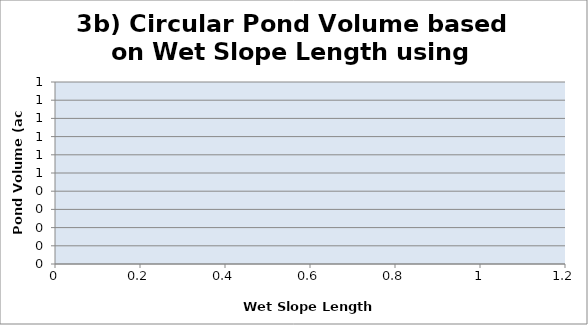
| Category | Series 0 |
|---|---|
|  | 0 |
|  | 0 |
|  | 0 |
|  | 0 |
|  | 0 |
|  | 0 |
|  | 0 |
|  | 0 |
|  | 0 |
|  | 0 |
|  | 0 |